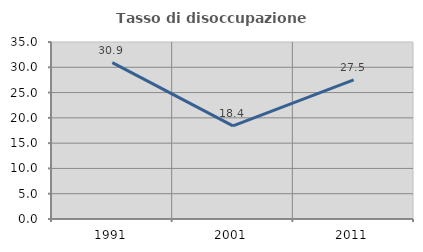
| Category | Tasso di disoccupazione giovanile  |
|---|---|
| 1991.0 | 30.914 |
| 2001.0 | 18.421 |
| 2011.0 | 27.519 |